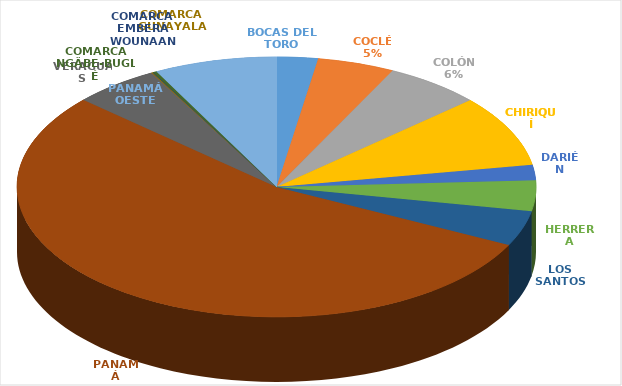
| Category | Cantidad  |
|---|---|
| BOCAS DEL TORO | 158 |
| COCLÉ | 296 |
| COLÓN | 371 |
| CHIRIQUÍ | 548 |
| DARIÉN | 118 |
| HERRERA | 235 |
| LOS SANTOS | 269 |
| PANAMÁ | 3346 |
| VERAGUAS | 329 |
| COMARCA GUNAYALA | 6 |
| COMARCA EMBERÁ WOUNAAN | 1 |
| COMARCA NGÄBE-BUGLÉ | 15 |
| PANAMÁ OESTE | 471 |